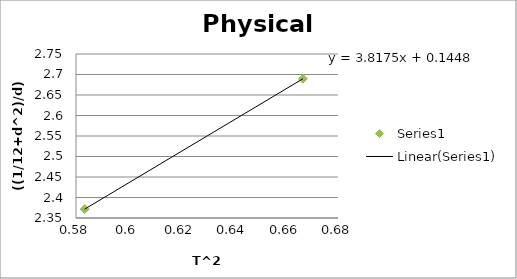
| Category | Series 0 |
|---|---|
| 0.5833 | 2.372 |
| 0.6666 | 2.69 |